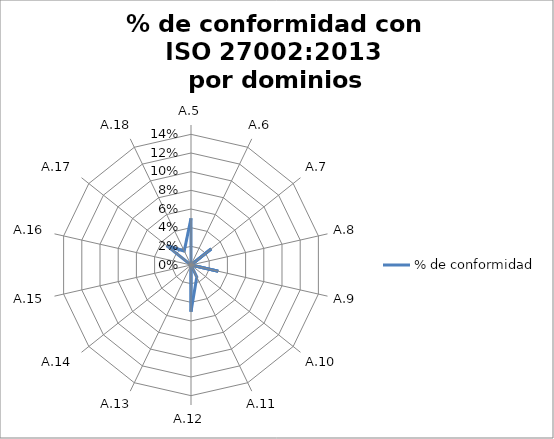
| Category | % de conformidad |
|---|---|
| A.5 | 0.05 |
| A.6 | 0 |
| A.7 | 0.028 |
| A.8 | 0 |
| A.9 | 0.03 |
| A.10 | 0 |
| A.11 | 0.014 |
| A.12 | 0.05 |
| A.13 | 0 |
| A.14 | 0 |
| A.15 | 0 |
| A.16 | 0 |
| A.17 | 0.033 |
| A.18 | 0.017 |